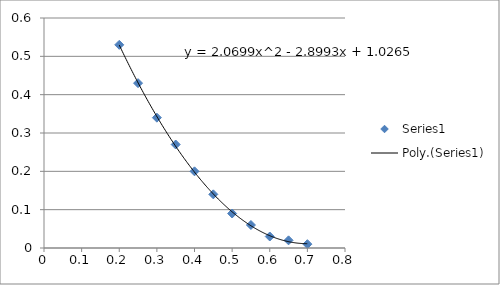
| Category | Series 0 |
|---|---|
| 0.2 | 0.53 |
| 0.25 | 0.43 |
| 0.3 | 0.34 |
| 0.35 | 0.27 |
| 0.4 | 0.2 |
| 0.45 | 0.14 |
| 0.5 | 0.09 |
| 0.55 | 0.06 |
| 0.6 | 0.03 |
| 0.65 | 0.02 |
| 0.7 | 0.01 |